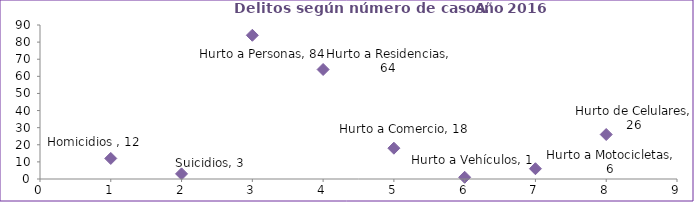
| Category | Series 0 |
|---|---|
| 0 | 12 |
| 1 | 3 |
| 2 | 84 |
| 3 | 64 |
| 4 | 18 |
| 5 | 1 |
| 6 | 6 |
| 7 | 26 |